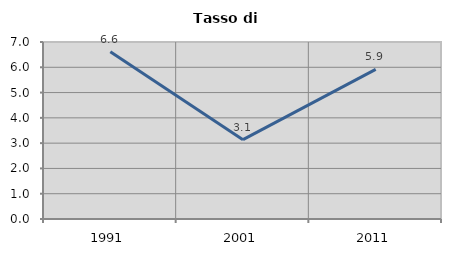
| Category | Tasso di disoccupazione   |
|---|---|
| 1991.0 | 6.614 |
| 2001.0 | 3.137 |
| 2011.0 | 5.917 |